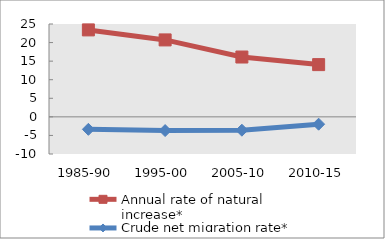
| Category | Annual rate of natural increase* | Crude net migration rate* |
|---|---|---|
| 1985-90 | 23.412 | -3.36 |
| 1995-00 | 20.716 | -3.691 |
| 2005-10 | 16.107 | -3.589 |
| 2010-15 | 14.066 | -1.975 |